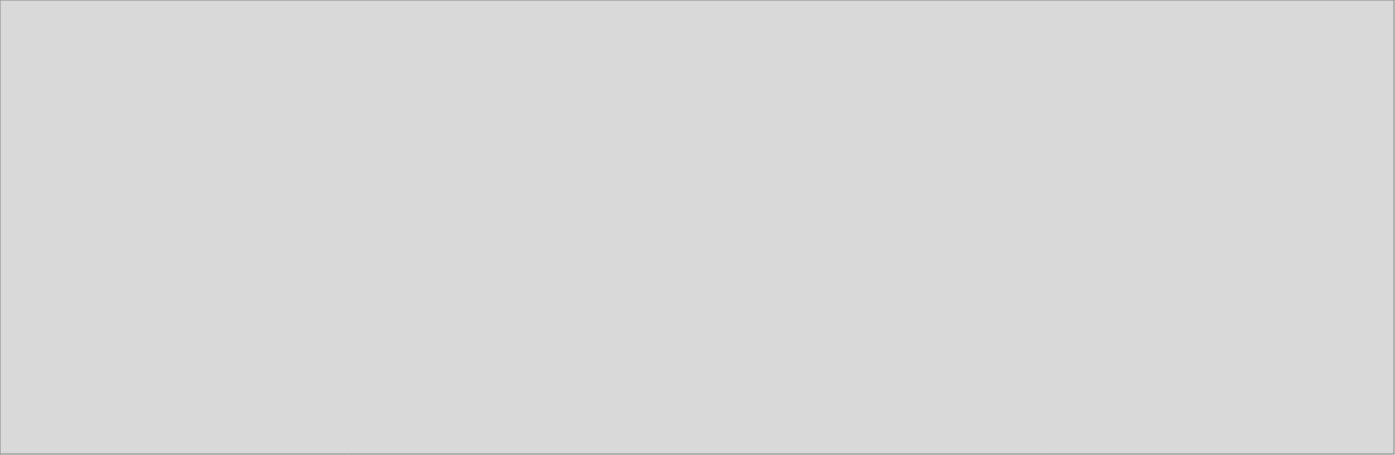
| Category | Transporte | Actividades de transporte complementarias y auxiliares; Agencias de viajes | Correos y comunicaciones |
|---|---|---|---|
| 2018_I | 5004.12 | 1009.739 | 4213.874 |
| 2018_II | 4796.201 | 1022.396 | 5299.568 |
| 2018_III | 3836.131 | 1046.162 | 4515.929 |
| 2018_IV | 4810.965 | 1010.448 | 4617.223 |
| 2019_I | 5311.168 | 1085.021 | 4619.374 |
| 2019_II | 5119.928 | 1047.515 | 5240.272 |
| 2019_III | 0 | 0 | 0 |
| 2019_IV | 0 | 0 | 0 |